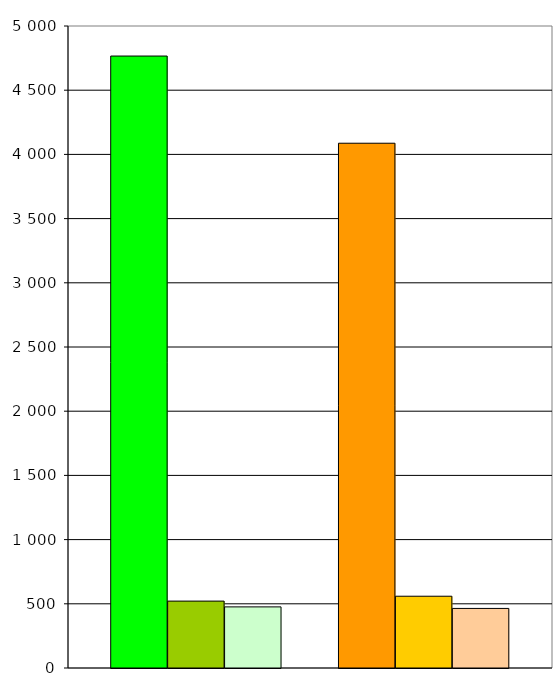
| Category | Series 0 | Series 1 | Series 2 | Series 3 | Series 4 | Series 5 | Series 6 |
|---|---|---|---|---|---|---|---|
| 0 | 4766 | 521 | 476 |  | 4087 | 559 | 464 |